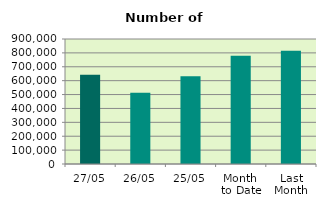
| Category | Series 0 |
|---|---|
| 27/05 | 642554 |
| 26/05 | 512240 |
| 25/05 | 631780 |
| Month 
to Date | 779031.6 |
| Last
Month | 814883.684 |